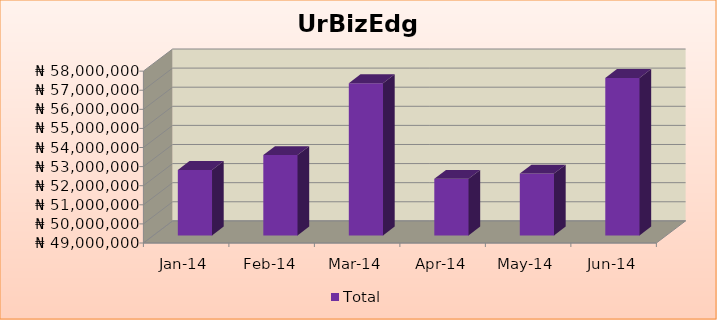
| Category | Total |
|---|---|
| 2014-01-01 | 52431000 |
| 2014-02-01 | 53210000 |
| 2014-03-01 | 56972000 |
| 2014-04-01 | 51969000 |
| 2014-05-01 | 52241000 |
| 2014-06-01 | 57247000 |